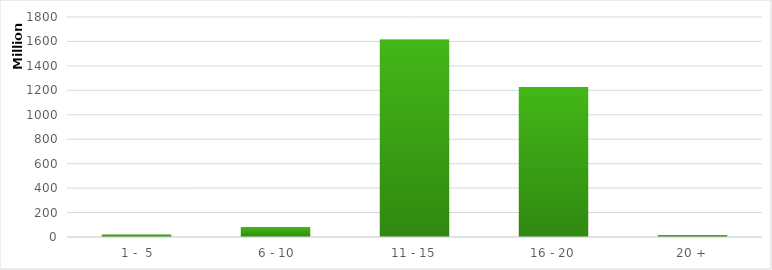
| Category | Series 0 |
|---|---|
|  1 -  5 | 19472181.31 |
|  6 - 10 | 82507211.69 |
| 11 - 15 | 1615462416.75 |
| 16 - 20 | 1227773198.18 |
| 20 + | 17282564.32 |